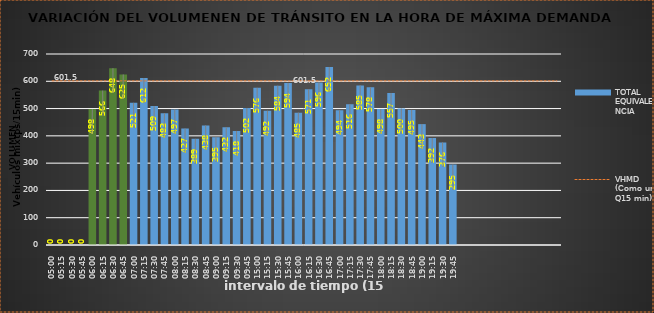
| Category | TOTAL EQUIVALENCIA   |
|---|---|
| 500.0 | 0 |
| 515.0 | 0 |
| 530.0 | 0 |
| 545.0 | 0 |
| 600.0 | 498 |
| 615.0 | 566 |
| 630.0 | 648 |
| 645.0 | 625 |
| 700.0 | 521 |
| 715.0 | 612 |
| 730.0 | 509 |
| 745.0 | 483 |
| 800.0 | 497 |
| 815.0 | 427 |
| 830.0 | 389 |
| 845.0 | 438 |
| 900.0 | 395 |
| 915.0 | 432 |
| 930.0 | 418 |
| 945.0 | 502 |
| 1500.0 | 576 |
| 1515.0 | 492 |
| 1530.0 | 584 |
| 1545.0 | 594 |
| 1600.0 | 485 |
| 1615.0 | 571 |
| 1630.0 | 596 |
| 1645.0 | 652 |
| 1700.0 | 494 |
| 1715.0 | 516 |
| 1730.0 | 585 |
| 1745.0 | 578 |
| 1800.0 | 498 |
| 1815.0 | 557 |
| 1830.0 | 500 |
| 1845.0 | 495 |
| 1900.0 | 443 |
| 1915.0 | 392 |
| 1930.0 | 376 |
| 1945.0 | 295 |